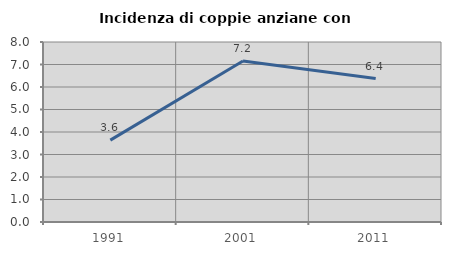
| Category | Incidenza di coppie anziane con figli |
|---|---|
| 1991.0 | 3.64 |
| 2001.0 | 7.155 |
| 2011.0 | 6.377 |